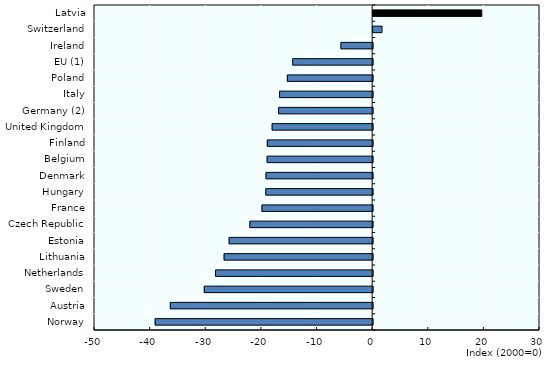
| Category | Series 0 |
|---|---|
| Norway | -39.1 |
| Austria | -36.367 |
| Sweden | -30.267 |
| Netherlands | -28.233 |
| Lithuania | -26.7 |
| Estonia | -25.8 |
| Czech Republic | -22.067 |
| France | -19.9 |
| Hungary | -19.2 |
| Denmark | -19.167 |
| Belgium | -18.967 |
| Finland | -18.933 |
| United Kingdom | -18.067 |
| Germany (2) | -16.9 |
| Italy | -16.733 |
| Poland | -15.333 |
| EU (1) | -14.367 |
| Ireland | -5.7 |
| Switzerland | 1.6 |
| Latvia | 19.533 |